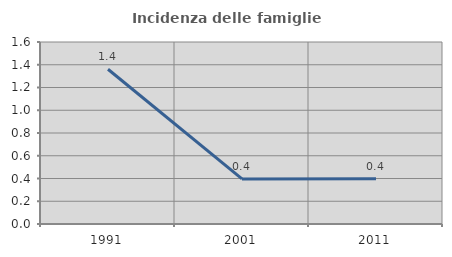
| Category | Incidenza delle famiglie numerose |
|---|---|
| 1991.0 | 1.36 |
| 2001.0 | 0.396 |
| 2011.0 | 0.397 |